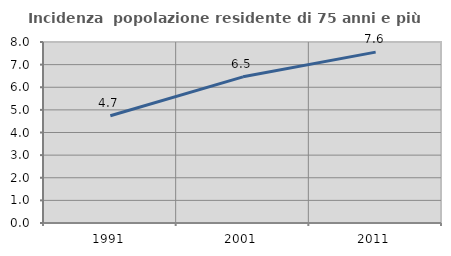
| Category | Incidenza  popolazione residente di 75 anni e più |
|---|---|
| 1991.0 | 4.74 |
| 2001.0 | 6.461 |
| 2011.0 | 7.553 |